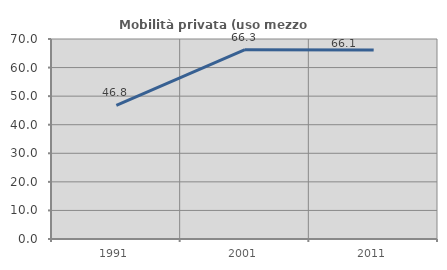
| Category | Mobilità privata (uso mezzo privato) |
|---|---|
| 1991.0 | 46.801 |
| 2001.0 | 66.25 |
| 2011.0 | 66.106 |